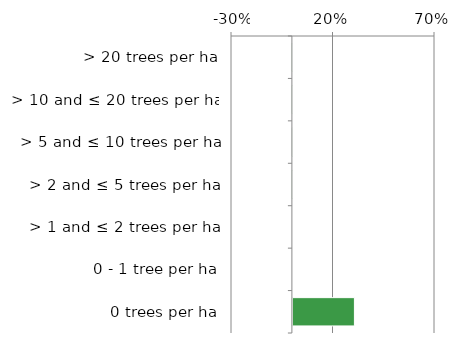
| Category | Non native |
|---|---|
| 0 trees per ha | 0.303 |
| 0 - 1 tree per ha | 0 |
| > 1 and ≤ 2 trees per ha | 0 |
| > 2 and ≤ 5 trees per ha | 0 |
| > 5 and ≤ 10 trees per ha | 0.001 |
| > 10 and ≤ 20 trees per ha | 0 |
| > 20 trees per ha | 0 |